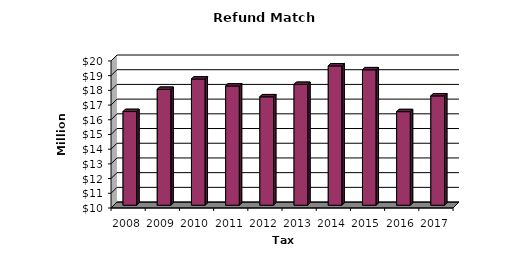
| Category | Total |
|---|---|
| 2008.0 | 16.367 |
| 2009.0 | 17.876 |
| 2010.0 | 18.578 |
| 2011.0 | 18.105 |
| 2012.0 | 17.369 |
| 2013.0 | 18.212 |
| 2014.0 | 19.469 |
| 2015.0 | 19.206 |
| 2016.0 | 16.36 |
| 2017.0 | 17.432 |